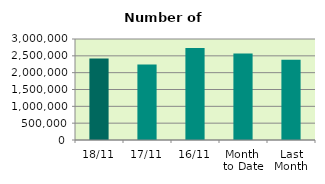
| Category | Series 0 |
|---|---|
| 18/11 | 2423006 |
| 17/11 | 2244472 |
| 16/11 | 2731214 |
| Month 
to Date | 2571807.143 |
| Last
Month | 2382963.143 |